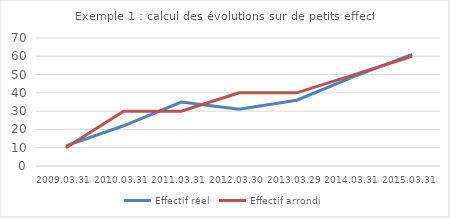
| Category | Effectif réel | Effectif arrondi |
|---|---|---|
| 2009.03.31 | 11 | 10 |
| 2010.03.31 | 22 | 30 |
| 2011.03.31 | 35 | 30 |
| 2012.03.30 | 31 | 40 |
| 2013.03.29 | 36 | 40 |
| 2014.03.31 | 49 | 50 |
| 2015.03.31 | 61 | 60 |